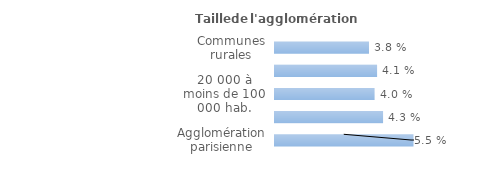
| Category | Series 0 |
|---|---|
| Communes rurales | 0.038 |
| moins de 20 000 hab. | 0.041 |
| 20 000 à moins de 100 000 hab. | 0.04 |
| 100 000 hab. ou plus | 0.043 |
| Agglomération parisienne | 0.055 |